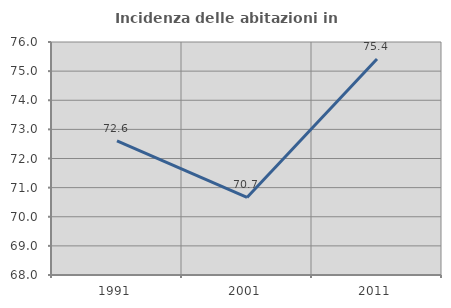
| Category | Incidenza delle abitazioni in proprietà  |
|---|---|
| 1991.0 | 72.603 |
| 2001.0 | 70.661 |
| 2011.0 | 75.417 |